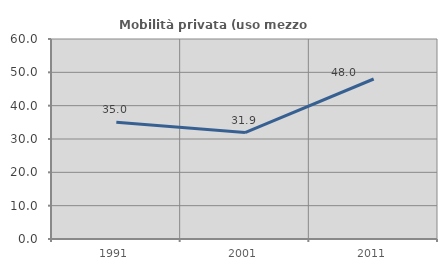
| Category | Mobilità privata (uso mezzo privato) |
|---|---|
| 1991.0 | 35 |
| 2001.0 | 31.915 |
| 2011.0 | 48 |